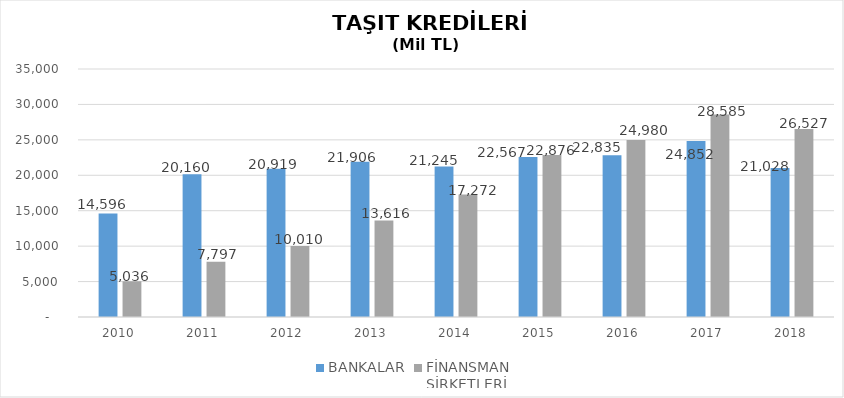
| Category | BANKALAR | FİNANSMAN 
ŞİRKETLERİ |
|---|---|---|
| 2010 | 14596 | 5035.89 |
| 2011 | 20160 | 7796.854 |
| 2012 | 20919 | 10009.755 |
| 2013 | 21906 | 13616.036 |
| 2014 | 21245 | 17271.844 |
| 2015 | 22567 | 22875.563 |
| 2016 | 22835 | 24980.231 |
| 2017 | 24852 | 28584.938 |
| 2018 | 21028 | 26527.133 |